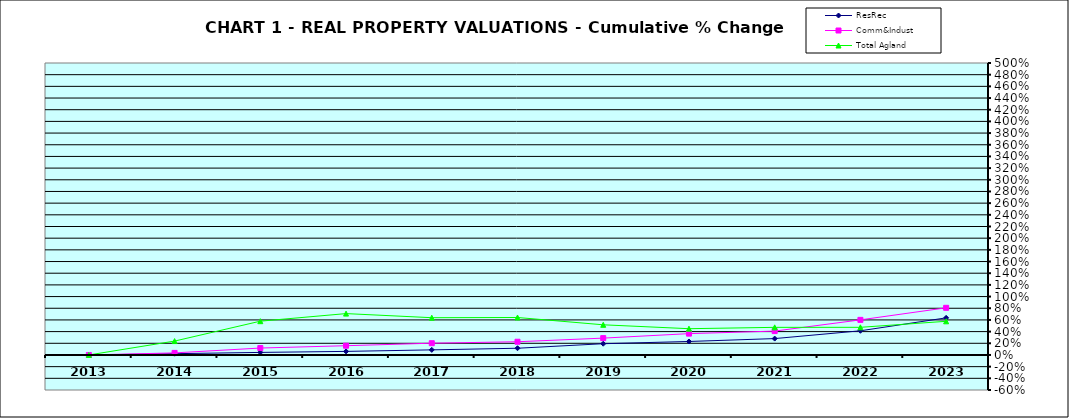
| Category | ResRec | Comm&Indust | Total Agland |
|---|---|---|---|
| 2013.0 | 0 | 0 | 0 |
| 2014.0 | 0.022 | 0.035 | 0.238 |
| 2015.0 | 0.044 | 0.119 | 0.578 |
| 2016.0 | 0.061 | 0.159 | 0.708 |
| 2017.0 | 0.087 | 0.201 | 0.638 |
| 2018.0 | 0.115 | 0.227 | 0.642 |
| 2019.0 | 0.193 | 0.288 | 0.516 |
| 2020.0 | 0.231 | 0.365 | 0.45 |
| 2021.0 | 0.28 | 0.409 | 0.473 |
| 2022.0 | 0.414 | 0.601 | 0.473 |
| 2023.0 | 0.635 | 0.807 | 0.577 |